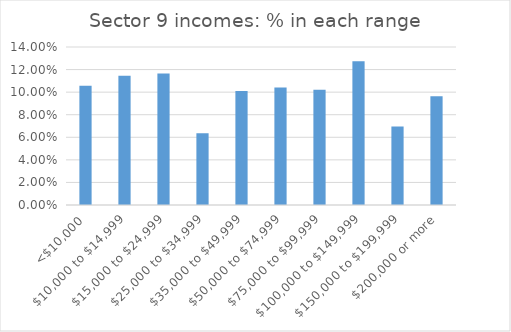
| Category | Series 0 |
|---|---|
| <$10,000 | 0.106 |
| $10,000 to $14,999 | 0.115 |
| $15,000 to $24,999 | 0.117 |
| $25,000 to $34,999 | 0.064 |
| $35,000 to $49,999 | 0.101 |
| $50,000 to $74,999 | 0.104 |
| $75,000 to $99,999 | 0.102 |
| $100,000 to $149,999 | 0.127 |
| $150,000 to $199,999 | 0.07 |
| $200,000 or more | 0.096 |